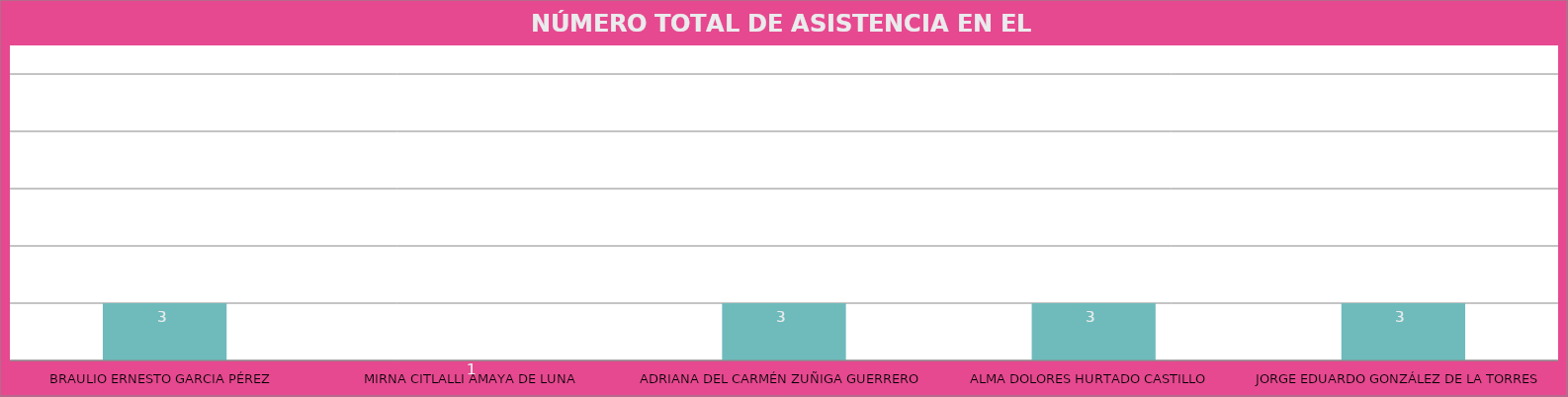
| Category | BRAULIO ERNESTO GARCIA PÉREZ |
|---|---|
| BRAULIO ERNESTO GARCIA PÉREZ | 3 |
| MIRNA CITLALLI AMAYA DE LUNA | 1 |
| ADRIANA DEL CARMÉN ZUÑIGA GUERRERO | 3 |
| ALMA DOLORES HURTADO CASTILLO | 3 |
| JORGE EDUARDO GONZÁLEZ DE LA TORRES | 3 |